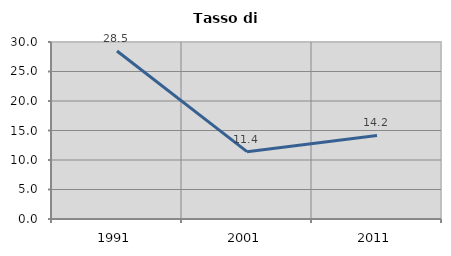
| Category | Tasso di disoccupazione   |
|---|---|
| 1991.0 | 28.467 |
| 2001.0 | 11.416 |
| 2011.0 | 14.165 |